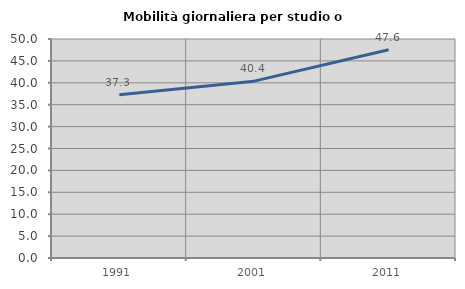
| Category | Mobilità giornaliera per studio o lavoro |
|---|---|
| 1991.0 | 37.264 |
| 2001.0 | 40.381 |
| 2011.0 | 47.563 |